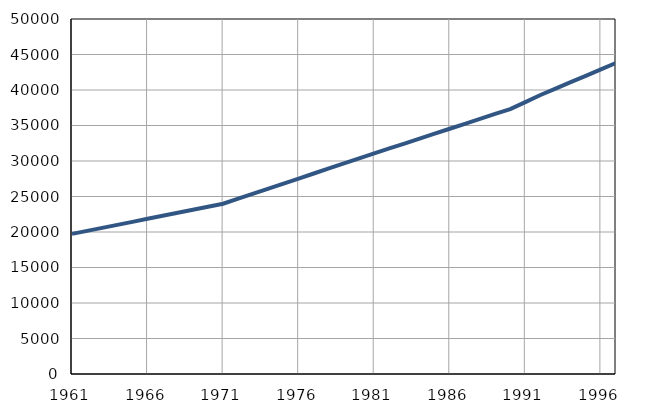
| Category | Број
становника |
|---|---|
| 1961.0 | 19735 |
| 1962.0 | 20159 |
| 1963.0 | 20583 |
| 1964.0 | 21007 |
| 1965.0 | 21431 |
| 1966.0 | 21855 |
| 1967.0 | 22279 |
| 1968.0 | 22703 |
| 1969.0 | 23127 |
| 1970.0 | 23551 |
| 1971.0 | 23977 |
| 1972.0 | 24687 |
| 1973.0 | 25397 |
| 1974.0 | 26107 |
| 1975.0 | 26817 |
| 1976.0 | 27527 |
| 1977.0 | 28237 |
| 1978.0 | 28947 |
| 1979.0 | 29657 |
| 1980.0 | 30367 |
| 1981.0 | 31072 |
| 1982.0 | 31766 |
| 1983.0 | 32460 |
| 1984.0 | 33154 |
| 1985.0 | 33848 |
| 1986.0 | 34542 |
| 1987.0 | 35236 |
| 1988.0 | 35930 |
| 1989.0 | 36624 |
| 1990.0 | 37318 |
| 1991.0 | 38300 |
| 1992.0 | 39300 |
| 1993.0 | 40200 |
| 1994.0 | 41100 |
| 1995.0 | 42000 |
| 1996.0 | 42900 |
| 1997.0 | 43800 |